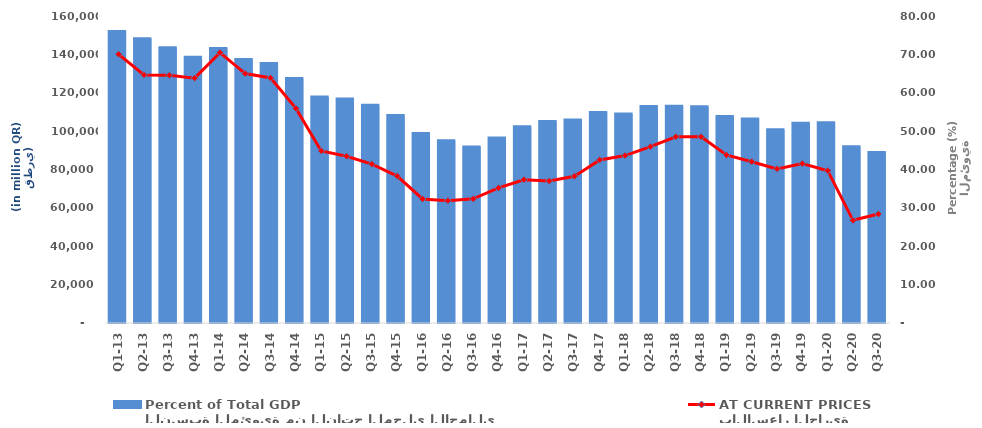
| Category | النسبة المئوية من الناتج المحلي الاجمالي
Percent of Total GDP |
|---|---|
| Q1-13 | 75.946 |
| Q2-13 | 74.046 |
| Q3-13 | 71.703 |
| Q4-13 | 69.223 |
| Q1-14 | 71.559 |
| Q2-14 | 68.65 |
| Q3-14 | 67.631 |
| Q4-14 | 63.697 |
| Q1-15 | 58.871 |
| Q2-15 | 58.366 |
| Q3-15 | 56.736 |
| Q4-15 | 54.08 |
| Q1-16 | 49.401 |
| Q2-16 | 47.461 |
| Q3-16 | 45.856 |
| Q4-16 | 48.228 |
| Q1-17 | 51.151 |
| Q2-17 | 52.494 |
| Q3-17 | 52.903 |
| Q4-17 | 54.876 |
| Q1-18 | 54.493 |
| Q2-18 | 56.411 |
| Q3-18 | 56.463 |
| Q4-18 | 56.326 |
| Q1-19 | 53.833 |
| Q2-19 | 53.151 |
| Q3-19 | 50.349 |
| Q4-19 | 52.034 |
| Q1-20 | 52.167 |
| Q2-20 | 45.9 |
| Q3-20 | 44.41 |